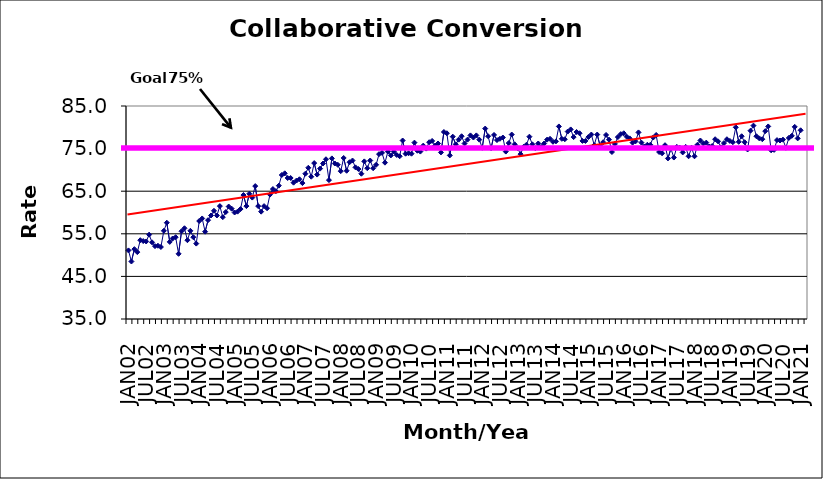
| Category | Series 0 |
|---|---|
| JAN02 | 51.1 |
| FEB02 | 48.5 |
| MAR02 | 51.4 |
| APR02 | 50.7 |
| MAY02 | 53.5 |
| JUN02 | 53.3 |
| JUL02 | 53.2 |
| AUG02 | 54.8 |
| SEP02 | 53 |
| OCT02 | 52.1 |
| NOV02 | 52.2 |
| DEC02 | 51.9 |
| JAN03 | 55.7 |
| FEB03 | 57.6 |
| MAR03 | 53.1 |
| APR03 | 53.9 |
| MAY03 | 54.2 |
| JUN03 | 50.3 |
| JUL03 | 55.6 |
| AUG03 | 56.3 |
| SEP03 | 53.5 |
| OCT03 | 55.7 |
| NOV03 | 54.2 |
| DEC03 | 52.7 |
| JAN04 | 58 |
| FEB04 | 58.6 |
| MAR04 | 55.5 |
| APR04 | 58.2 |
| MAY04 | 59.3 |
| JUN04 | 60.4 |
| JUL04 | 59.3 |
| AUG04 | 61.5 |
| SEP04 | 58.9 |
| OCT04 | 60.1 |
| NOV04 | 61.4 |
| DEC04 | 60.9 |
| JAN05 | 60 |
| FEB05 | 60.2 |
| MAR05 | 60.8 |
| APR05 | 64.1 |
| MAY05 | 61.5 |
| JUN05 | 64.4 |
| JUL05 | 63.5 |
| AUG05 | 66.2 |
| SEP05 | 61.5 |
| OCT05 | 60.2 |
| NOV05 | 61.5 |
| DEC05 | 61 |
| JAN06 | 64.2 |
| FEB06 | 65.5 |
| MAR06 | 65 |
| APR06 | 66.3 |
| MAY06 | 68.8 |
| JUN06 | 69.2 |
| JUL06 | 68.1 |
| AUG06 | 68.1 |
| SEP06 | 67 |
| OCT06 | 67.5 |
| NOV06 | 67.8 |
| DEC06 | 66.9 |
| JAN07 | 69.1 |
| FEB07 | 70.5 |
| MAR07 | 68.4 |
| APR07 | 71.6 |
| MAY07 | 68.9 |
| JUN07 | 70.3 |
| JUL07 | 71.5 |
| AUG07 | 72.5 |
| SEP07 | 67.6 |
| OCT07 | 72.7 |
| NOV07 | 71.5 |
| DEC07 | 71.2 |
| JAN08 | 69.7 |
| FEB08 | 72.8 |
| MAR08 | 69.8 |
| APR08 | 71.8 |
| MAY08 | 72.2 |
| JUN08 | 70.6 |
| JUL08 | 70.2 |
| AUG08 | 69.1 |
| SEP08 | 72 |
| OCT08 | 70.4 |
| NOV08 | 72.2 |
| DEC08 | 70.4 |
| JAN09 | 71.2 |
| FEB09 | 73.7 |
| MAR09 | 74 |
| APR09 | 71.7 |
| MAY09 | 74.3 |
| JUN09 | 73.4 |
| JUL09 | 74.3 |
| AUG09 | 73.5 |
| SEP09 | 73.2 |
| OCT09 | 76.9 |
| NOV09 | 73.8 |
| DEC09 | 73.9 |
| JAN10 | 73.8 |
| FEB10 | 76.4 |
| MAR10 | 74.5 |
| APR10 | 74.3 |
| MAY10 | 75.7 |
| JUN10 | 75 |
| JUL10 | 76.5 |
| AUG10 | 76.8 |
| SEP10 | 75.7 |
| OCT10 | 76.2 |
| NOV10 | 74.1 |
| DEC10 | 78.9 |
| JAN11 | 78.6 |
| FEB11 | 73.4 |
| MAR11 | 77.8 |
| APR11 | 76 |
| MAY11 | 77.1 |
| JUN11 | 77.9 |
| JUL11 | 76.2 |
| AUG11 | 77.1 |
| SEP11 | 78.1 |
| OCT11 | 77.6 |
| NOV11 | 78.1 |
| DEC11 | 77.1 |
| JAN12 | 75.2 |
| FEB12 | 79.7 |
| MAR12 | 77.9 |
| APR12 | 75.1 |
| MAY12 | 78.2 |
| JUN12 | 77 |
| JUL12 | 77.3 |
| AUG12 | 77.6 |
| SEP12 | 74.3 |
| OCT12 | 76.3 |
| NOV12 | 78.3 |
| DEC12 | 76 |
| JAN13 | 75.1 |
| FEB13 | 73.7 |
| MAR13 | 75.4 |
| APR13 | 75.9 |
| MAY13 | 77.8 |
| JUN13 | 76 |
| JUL13 | 75.1 |
| AUG13 | 76.2 |
| SEP13 | 75.4 |
| OCT13 | 76.2 |
| NOV13 | 77.1 |
| DEC13 | 77.3 |
| JAN14 | 76.6 |
| FEB14 | 76.7 |
| MAR14 | 80.2 |
| APR14 | 77.3 |
| MAY14 | 77.2 |
| JUN14 | 79 |
| JUL14 | 79.5 |
| AUG14 | 77.7 |
| SEP14 | 78.9 |
| OCT14 | 78.6 |
| NOV14 | 76.8 |
| DEC14 | 76.8 |
| JAN15 | 77.7 |
| FEB15 | 78.3 |
| MAR15 | 75.8 |
| APR15 | 78.3 |
| MAY15 | 75.6 |
| JUN15 | 76.5 |
| JUL15 | 78.2 |
| AUG15 | 77.1 |
| SEP15 | 74.2 |
| OCT15 | 76.1 |
| NOV15 | 77.7 |
| DEC15 | 78.4 |
| JAN16 | 78.6 |
| FEB16 | 77.8 |
| MAR16 | 77.4 |
| APR16 | 76.4 |
| MAY16 | 76.7 |
| JUN16 | 78.8 |
| JUL16 | 76.4 |
| AUG16 | 75.5 |
| SEP16 | 75.9 |
| OCT16 | 75.9 |
| NOV16 | 77.6 |
| DEC16 | 78.2 |
| JAN17 | 74.2 |
| FEB17 | 73.9 |
| MAR17 | 75.8 |
| APR17 | 72.7 |
| MAY17 | 75 |
| JUN17 | 72.9 |
| JUL17 | 75.4 |
| AUG17 | 75.2 |
| SEP17 | 74.1 |
| OCT17 | 75.4 |
| NOV17 | 73.2 |
| DEC17 | 75.2 |
| JAN18 | 73.2 |
| FEB18 | 75.9 |
| MAR18 | 76.9 |
| APR18 | 76.2 |
| MAY18 | 76.4 |
| JUN18 | 75.5 |
| JUL18 | 75.6 |
| AUG18 | 77.2 |
| SEP18 | 76.7 |
| OCT18 | 75.3 |
| NOV18 | 76.3 |
| DEC18 | 77.2 |
| JAN19 | 76.8 |
| FEB19 | 76.5 |
| MAR19 | 80 |
| APR19 | 76.6 |
| MAY19 | 77.9 |
| JUN19 | 76.5 |
| JUL19 | 74.8 |
| AUG19 | 79.2 |
| SEP19 | 80.4 |
| OCT19 | 77.9 |
| NOV19 | 77.4 |
| DEC19 | 77.2 |
| JAN20 | 79.1 |
| FEB20 | 80.2 |
| MAR20 | 74.6 |
| APR20 | 74.7 |
| MAY20 | 77 |
| JUN20 | 76.9 |
| JUL20 | 77.1 |
| AUG20 | 75.2 |
| SEP20 | 77.5 |
| OCT20 | 78 |
| NOV20 | 80.1 |
| DEC20 | 77.4 |
| JAN21 | 79.3 |